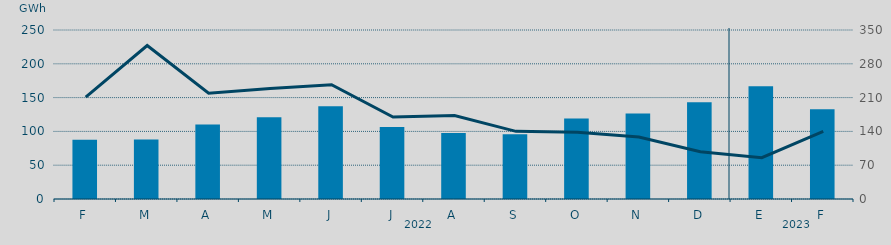
| Category | Energía a subir |
|---|---|
| F | 87.769 |
| M | 87.943 |
| A | 110.173 |
| M | 120.911 |
| J | 137.249 |
| J | 106.554 |
| A | 97.587 |
| S | 95.748 |
| O | 118.914 |
| N | 126.653 |
| D | 143.004 |
| E | 166.862 |
| F | 132.923 |